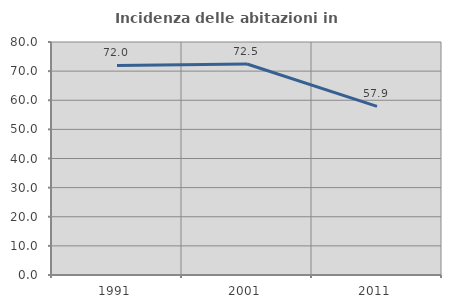
| Category | Incidenza delle abitazioni in proprietà  |
|---|---|
| 1991.0 | 71.951 |
| 2001.0 | 72.464 |
| 2011.0 | 57.895 |